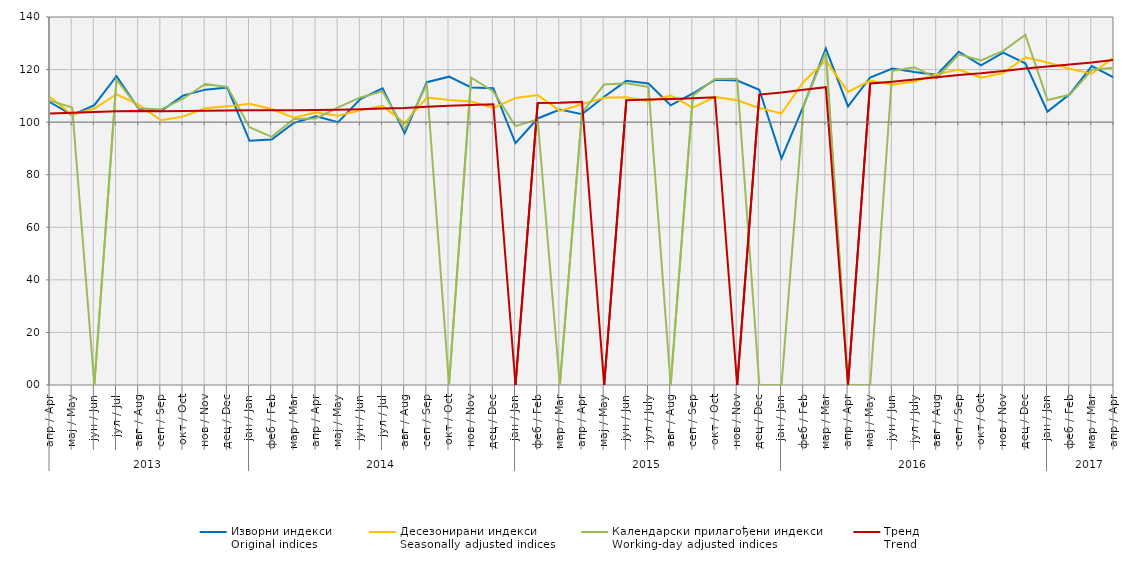
| Category | Изворни индекси
Original indices | Десезонирани индекси
Seasonally adjusted indices | Календарски прилагођени индекси
Working-day adjusted indices | Тренд
Trend |
|---|---|---|---|---|
| 0 | 107.567 | 109.6 | 108.2 | 103.3 |
| 1 | 102.635 | 102.8 | 105.6 | 103.6 |
| 2 | 106.478 | 105.2 | 0 | 103.9 |
| 3 | 117.488 | 110.6 | 116.2 | 104.1 |
| 4 | 105.073 | 106.7 | 105.3 | 104.2 |
| 5 | 104.198 | 100.7 | 104.8 | 104.1 |
| 6 | 110.096 | 102.1 | 108.9 | 104.2 |
| 7 | 112.368 | 105.3 | 114.5 | 104.3 |
| 8 | 113.169 | 106 | 113.4 | 104.4 |
| 9 | 92.9 | 107 | 98.1 | 104.5 |
| 10 | 93.4 | 105 | 94.4 | 104.5 |
| 11 | 99.7 | 101.7 | 101.2 | 104.5 |
| 12 | 102.2 | 103.7 | 101.4 | 104.6 |
| 13 | 100 | 102.4 | 105.6 | 104.7 |
| 14 | 108.8 | 104.5 | 109.4 | 104.9 |
| 15 | 112.9 | 106.2 | 111.7 | 105.2 |
| 16 | 95.8 | 99.6 | 97.2 | 105.4 |
| 17 | 115.2 | 109.4 | 114.4 | 105.9 |
| 18 | 117.3 | 108.4 | 0 | 106.2 |
| 19 | 113.2 | 107.9 | 116.9 | 106.5 |
| 20 | 112.9 | 105.4 | 111.7 | 106.8 |
| 21 | 92 | 109.2 | 98.5 | 0 |
| 22 | 101.4 | 110.3 | 101.1 | 107.3 |
| 23 | 104.8 | 104.3 | 0 | 107.4 |
| 24 | 103 | 106.8 | 103.6 | 107.7 |
| 25 | 109.651 | 109.3 | 114.3 | 0 |
| 26 | 115.698 | 109.5 | 114.8 | 108.3 |
| 27 | 114.7 | 108 | 113.4 | 108.6 |
| 28 | 106.4 | 110.1 | 0 | 108.8 |
| 29 | 110.9 | 105.5 | 110.1 | 109.1 |
| 30 | 116.1 | 109.6 | 116.4 | 109.5 |
| 31 | 115.8 | 108.3 | 116.5 | 0 |
| 32 | 112.3 | 105.4 | 0 | 110.5 |
| 33 | 86.2 | 103.3 | 0 | 111.3 |
| 34 | 106.3 | 115.4 | 106.6 | 112.3 |
| 35 | 128 | 123.5 | 126.6 | 113.3 |
| 36 | 106 | 111.5 | 0 | 0 |
| 37 | 117 | 115.8 | 0 | 114.7 |
| 38 | 120.4 | 114.2 | 119.5 | 115.4 |
| 39 | 119.1 | 115.5 | 120.9 | 116.2 |
| 40 | 118 | 118.2 | 116.7 | 117.1 |
| 41 | 126.8 | 120 | 125.8 | 117.9 |
| 42 | 121.6 | 116.9 | 123.5 | 118.6 |
| 43 | 126.424 | 118.7 | 127.1 | 119.5 |
| 44 | 122.4 | 124.7 | 133.2 | 120.4 |
| 45 | 104 | 122.7 | 108.4 | 121.2 |
| 46 | 110.6 | 120.3 | 110.4 | 121.9 |
| 47 | 121.316 | 118.4 | 119.9 | 122.7 |
| 48 | 116.9 | 124.7 | 120.7 | 123.7 |